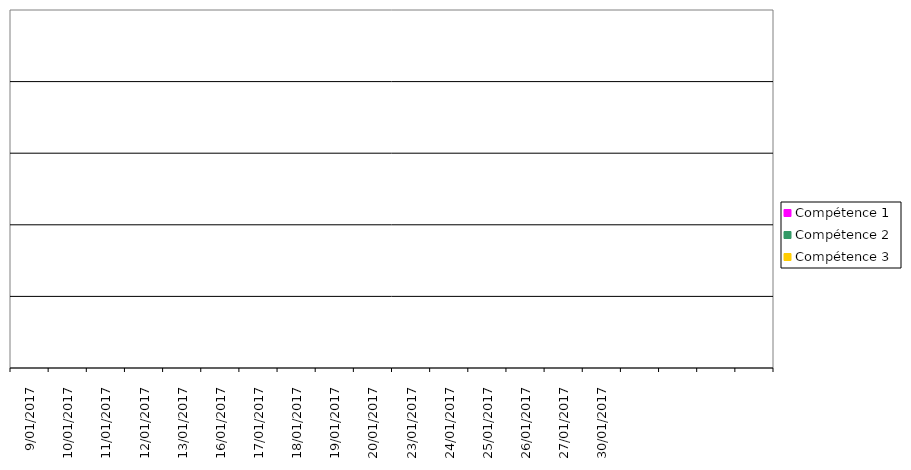
| Category | Compétence 1 | Compétence 2 | Compétence 3 |
|---|---|---|---|
| 9/01/2017 | 0 | 0 | 0 |
| 10/01/2017 | 0 | 0 | 0 |
| 11/01/2017 | 0 | 0 | 0 |
| 12/01/2017 | 0 | 0 | 0 |
| 13/01/2017 | 0 | 0 | 0 |
| 16/01/2017 | 0 | 0 | 0 |
| 17/01/2017 | 0 | 0 | 0 |
| 18/01/2017 | 0 | 0 | 0 |
| 19/01/2017 | 0 | 0 | 0 |
| 20/01/2017 | 0 | 0 | 0 |
| 23/01/2017 | 0 | 0 | 0 |
| 24/01/2017 | 0 | 0 | 0 |
| 25/01/2017 | 0 | 0 | 0 |
| 26/01/2017 | 0 | 0 | 0 |
| 27/01/2017 | 0 | 0 | 0 |
| 30/01/2017 | 0 | 0 | 0 |